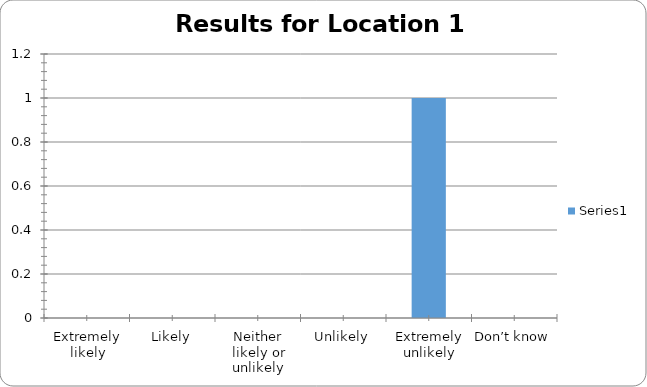
| Category | Series 0 |
|---|---|
| Extremely likely | 0 |
| Likely | 0 |
| Neither likely or unlikely | 0 |
| Unlikely | 0 |
| Extremely unlikely | 1 |
| Don’t know | 0 |